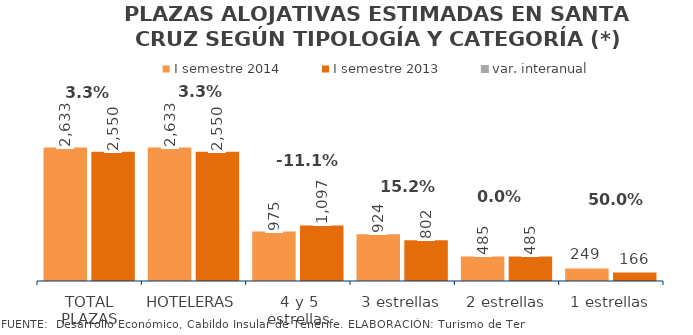
| Category | I semestre 2014 | I semestre 2013 |
|---|---|---|
| TOTAL PLAZAS | 2633 | 2550 |
| HOTELERAS | 2633 | 2550 |
| 4 y 5 estrellas | 975 | 1097 |
| 3 estrellas | 924 | 802 |
| 2 estrellas | 485 | 485 |
| 1 estrellas | 249 | 166 |